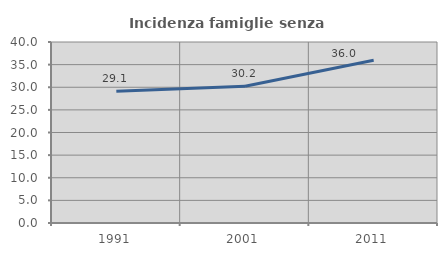
| Category | Incidenza famiglie senza nuclei |
|---|---|
| 1991.0 | 29.14 |
| 2001.0 | 30.218 |
| 2011.0 | 35.971 |